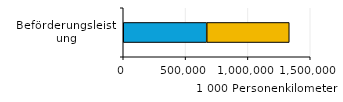
| Category | Öffentliche Unternehmen | Private und gemischtwirtschaftliche Unternehmen |
|---|---|---|
| 0 | 669556 | 662165 |